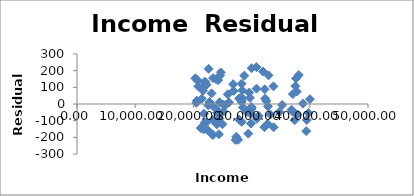
| Category | Series 0 |
|---|---|
| 30000.0 | -30.679 |
| 32329.0 | 31.987 |
| 32525.0 | 17.972 |
| 32805.0 | -14.158 |
| 31214.0 | -71.006 |
| 28287.0 | 38.523 |
| 26123.0 | 9.94 |
| 23182.0 | -5.837 |
| 25197.0 | -4.79 |
| 28487.0 | -20.642 |
| 29977.0 | -21.058 |
| 29955.0 | -18.115 |
| 33213.0 | -63.053 |
| 36864.0 | -34.156 |
| 34751.0 | -47.869 |
| 37854.0 | -62.753 |
| 37518.0 | 107.375 |
| 37409.0 | -97.513 |
| 39784.0 | -53.748 |
| 40023.0 | 28.937 |
| 38812.0 | 2.418 |
| 37749.0 | 74.625 |
| 37655.0 | 153.445 |
| 39480.0 | -96.078 |
| 39383.0 | -162.779 |
| 38100.0 | 173.7 |
| 37083.0 | -46.552 |
| 37085.0 | 59.504 |
| 35251.0 | -5.737 |
| 32757.0 | -119.016 |
| 33756.0 | 105.676 |
| 32192.0 | -139.311 |
| 29714.0 | 36.871 |
| 27852.0 | -93.434 |
| 26824.0 | 118.735 |
| 29838.0 | -57.864 |
| 30844.0 | 92.082 |
| 33784.0 | -139.898 |
| 30905.0 | -88.464 |
| 29876.0 | -117.241 |
| 29583.0 | 68.705 |
| 28306.0 | 23.405 |
| 25572.0 | -4.978 |
| 25159.0 | -45.192 |
| 24255.0 | 143.073 |
| 21937.0 | -111.852 |
| 21447.0 | 31.355 |
| 24443.0 | -87.776 |
| 23376.0 | 155.656 |
| 23914.0 | 148.551 |
| 22095.0 | 131.034 |
| 20338.0 | 153.847 |
| 20821.0 | 106.783 |
| 24596.0 | 171.604 |
| 24091.0 | -52.66 |
| 21263.0 | -144.5 |
| 20511.0 | 7.012 |
| 21823.0 | -58.322 |
| 21741.0 | -152.998 |
| 23959.0 | -32.056 |
| 25901.0 | 58.082 |
| 23357.0 | -185.999 |
| 24038.0 | -122.03 |
| 22757.0 | 12.128 |
| 20680.0 | 142.959 |
| 23158.0 | -178.967 |
| 20593.0 | 19.986 |
| 21442.0 | -139.985 |
| 22251.0 | 115.251 |
| 21899.0 | 132.632 |
| 21402.0 | 95.006 |
| 23129.0 | 63.673 |
| 22608.0 | 211.096 |
| 24704.0 | 189.642 |
| 28399.0 | 81.45 |
| 32241.0 | 87.883 |
| 29442.0 | -177.645 |
| 28749.0 | 170.066 |
| 26915.0 | 78.436 |
| 28273.0 | 12.419 |
| 27362.0 | -196.811 |
| 30001.0 | 214.804 |
| 28283.0 | 121.763 |
| 27684.0 | -215.003 |
| 28291.0 | -107.108 |
| 31948.0 | 195.306 |
| 32899.0 | 171.987 |
| 30826.0 | 221.435 |
| 29183.0 | -48.366 |
| 27851.0 | 33.382 |
| 27257.0 | -215.618 |
| 24506.0 | 10.302 |
| 23352.0 | -96.123 |
| 21642.0 | 79.566 |
| 22538.0 | -7.619 |
| 24383.0 | -181.633 |
| 21852.0 | -146.665 |
| 22225.0 | -110.889 |
| 22487.0 | -157.958 |
| 24992.0 | -121.56 |